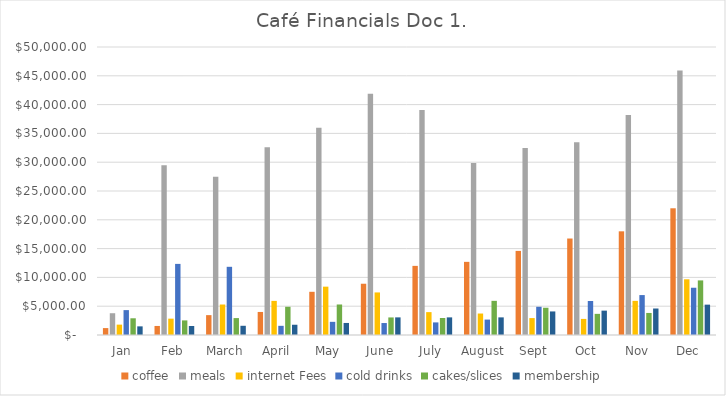
| Category | coffee | meals | internet Fees | cold drinks | cakes/slices | membership |
|---|---|---|---|---|---|---|
| Jan | 1200 | 3780 | 1800 | 4320 | 2902 | 1500 |
| Feb | 1570 | 29470 | 2837 | 12345 | 2535 | 1560 |
| March | 3450 | 27493 | 5293 | 11839 | 2937 | 1600 |
| April | 4000 | 32590 | 5923 | 1593 | 4902 | 1780 |
| May | 7500 | 35982 | 8392 | 2285 | 5298 | 2090 |
| June | 8900 | 41893 | 7391 | 2078 | 3050 | 3060 |
| July | 12000 | 39072 | 3972 | 2187 | 2950 | 3060 |
| August | 12700 | 29842 | 3728 | 2678 | 5930 | 3060 |
| Sept | 14600 | 32481 | 2937 | 4903 | 4732 | 4090 |
| Oct | 16750 | 33478 | 2793 | 5904 | 3671 | 4230 |
| Nov | 18000 | 38197 | 5927 | 6932 | 3827 | 4600 |
| Dec | 22000 | 45937 | 9672 | 8204 | 9478 | 5270 |